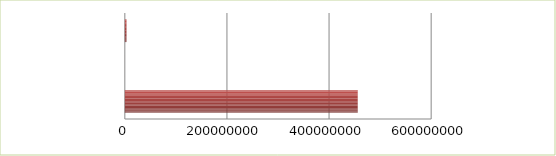
| Category | Series 0 | Series 1 |
|---|---|---|
| 0 | 2.5 | 456157669.51 |
| 1 | 2.6 | 11739.5 |
| 2 | 2.7 | 3325183.2 |